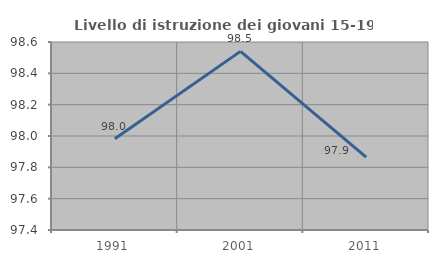
| Category | Livello di istruzione dei giovani 15-19 anni |
|---|---|
| 1991.0 | 97.982 |
| 2001.0 | 98.54 |
| 2011.0 | 97.865 |